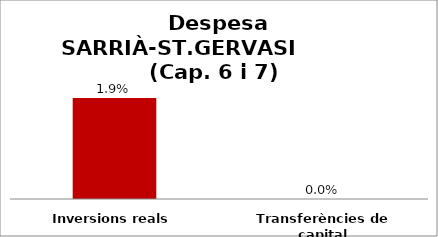
| Category | Series 0 |
|---|---|
| Inversions reals | 0.019 |
| Transferències de capital | 0 |